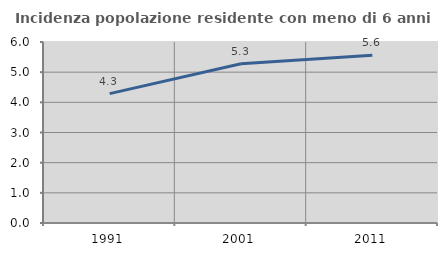
| Category | Incidenza popolazione residente con meno di 6 anni |
|---|---|
| 1991.0 | 4.288 |
| 2001.0 | 5.278 |
| 2011.0 | 5.563 |